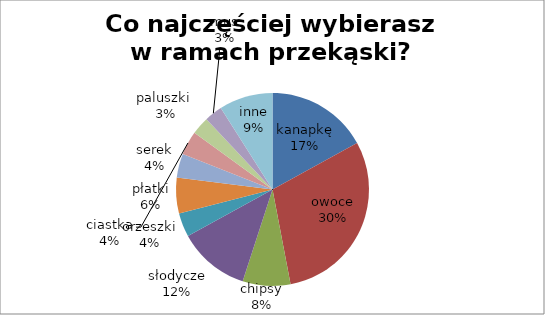
| Category | Co najczęściej wybierasz w ramach przekąski? |
|---|---|
| kanapkę | 17 |
| owoce | 30 |
| chipsy | 8 |
| słodycze | 12 |
| orzeszki | 4 |
| płatki | 6 |
| serek | 4 |
| ciastka | 4 |
| paluszki  | 3 |
| mus | 3 |
| inne | 9 |